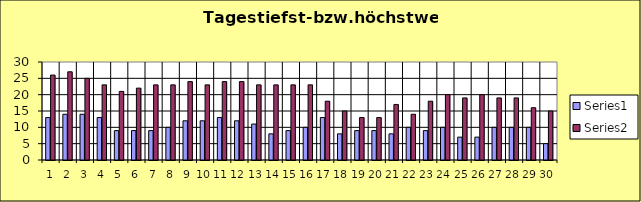
| Category | Series 0 | Series 1 |
|---|---|---|
| 0 | 13 | 26 |
| 1 | 14 | 27 |
| 2 | 14 | 25 |
| 3 | 13 | 23 |
| 4 | 9 | 21 |
| 5 | 9 | 22 |
| 6 | 9 | 23 |
| 7 | 10 | 23 |
| 8 | 12 | 24 |
| 9 | 12 | 23 |
| 10 | 13 | 24 |
| 11 | 12 | 24 |
| 12 | 11 | 23 |
| 13 | 8 | 23 |
| 14 | 9 | 23 |
| 15 | 10 | 23 |
| 16 | 13 | 18 |
| 17 | 8 | 15 |
| 18 | 9 | 13 |
| 19 | 9 | 13 |
| 20 | 8 | 17 |
| 21 | 10 | 14 |
| 22 | 9 | 18 |
| 23 | 10 | 20 |
| 24 | 7 | 19 |
| 25 | 7 | 20 |
| 26 | 10 | 19 |
| 27 | 10 | 19 |
| 28 | 10 | 16 |
| 29 | 5 | 15 |